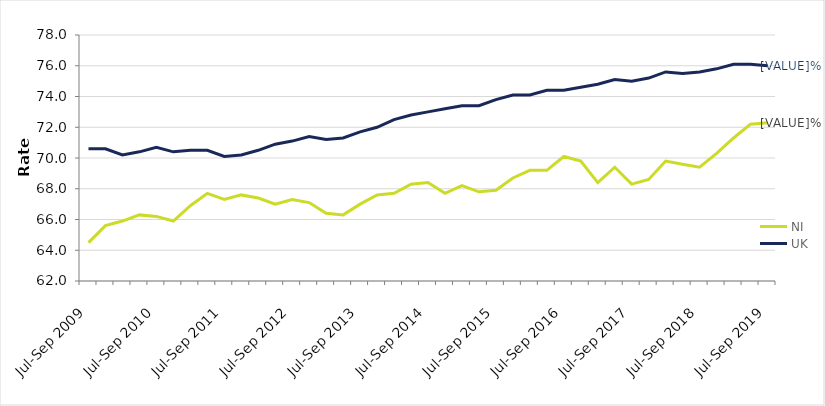
| Category | NI | UK |
|---|---|---|
| Jul-Sep 2009 | 64.5 | 70.6 |
| Oct-Dec 2009 | 65.6 | 70.6 |
| Jan-Mar 2010 | 65.9 | 70.2 |
| Apr-Jun 2010 | 66.3 | 70.4 |
| Jul-Sep 2010 | 66.2 | 70.7 |
| Oct-Dec 2010 | 65.9 | 70.4 |
| Jan-Mar 2011 | 66.9 | 70.5 |
| Apr-Jun 2011 | 67.7 | 70.5 |
| Jul-Sep 2011 | 67.3 | 70.1 |
| Oct-Dec 2011 | 67.6 | 70.2 |
| Jan-Mar 2012 | 67.4 | 70.5 |
| Apr-Jun 2012 | 67 | 70.9 |
| Jul-Sep 2012 | 67.3 | 71.1 |
| Oct-Dec 2012 | 67.1 | 71.4 |
| Jan-Mar 2013 | 66.4 | 71.2 |
| Apr-Jun 2013 | 66.3 | 71.3 |
| Jul-Sep 2013 | 67 | 71.7 |
| Oct-Dec 2013 | 67.6 | 72 |
| Jan-Mar 2014 | 67.7 | 72.5 |
| Apr-Jun 2014 | 68.3 | 72.8 |
| Jul-Sep 2014 | 68.4 | 73 |
| Oct-Dec 2014 | 67.7 | 73.2 |
| Jan-Mar 2015 | 68.2 | 73.4 |
| Apr-Jun 2015 | 67.8 | 73.4 |
| Jul-Sep 2015 | 67.9 | 73.8 |
| Oct-Dec 2015 | 68.7 | 74.1 |
| Jan-Mar 2016 | 69.2 | 74.1 |
| Apr-Jun 2016 | 69.2 | 74.4 |
| Jul-Sep 2016 | 70.1 | 74.4 |
| Oct-Dec 2016 | 69.8 | 74.6 |
| Jan-Mar 2017 | 68.4 | 74.8 |
| Apr-Jun 2017 | 69.4 | 75.1 |
| Jul-Sep 2017 | 68.3 | 75 |
| Oct-Dec 2017 | 68.6 | 75.2 |
| Jan-Mar 2018 | 69.8 | 75.6 |
| Apr-Jun 2018 | 69.6 | 75.5 |
| Jul-Sep 2018 | 69.4 | 75.6 |
| Oct-Dec 2018 | 70.3 | 75.8 |
| Jan-Mar 2019 | 71.3 | 76.1 |
| Apr-Jun 2019 | 72.2 | 76.1 |
| Jul-Sep 2019 | 72.3 | 76 |